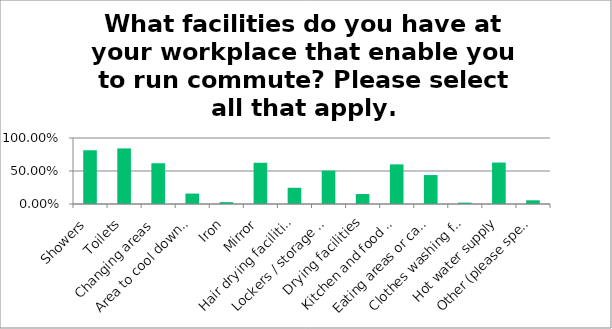
| Category | Responses |
|---|---|
| Showers | 0.814 |
| Toilets | 0.842 |
| Changing areas | 0.618 |
| Area to cool down/stretch in | 0.158 |
| Iron | 0.028 |
| Mirror | 0.625 |
| Hair drying facilities | 0.246 |
| Lockers / storage facilities | 0.505 |
| Drying facilities | 0.151 |
| Kitchen and food storage facilities | 0.6 |
| Eating areas or cafeterias | 0.439 |
| Clothes washing facilities | 0.021 |
| Hot water supply | 0.628 |
| Other (please specify) | 0.056 |